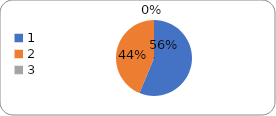
| Category | Series 0 |
|---|---|
| 0 | 72 |
| 1 | 56 |
| 2 | 0 |